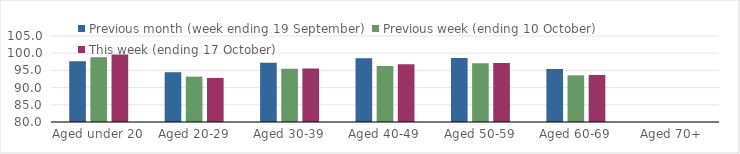
| Category | Previous month (week ending 19 September) | Previous week (ending 10 October) | This week (ending 17 October) |
|---|---|---|---|
| Aged under 20 | 97.64 | 98.82 | 99.61 |
| Aged 20-29 | 94.47 | 93.19 | 92.81 |
| Aged 30-39 | 97.26 | 95.46 | 95.54 |
| Aged 40-49 | 98.54 | 96.25 | 96.78 |
| Aged 50-59 | 98.62 | 97.06 | 97.16 |
| Aged 60-69 | 95.38 | 93.56 | 93.68 |
| Aged 70+ | 79.74 | 77.21 | 76.76 |